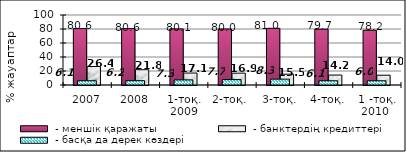
| Category |  - меншік қаражаты |  - банктердің кредиттері |
|---|---|---|
| 2007 | 80.595 | 26.395 |
| 2008 | 80.552 | 21.842 |
| 1-тоқ. 2009 | 80.13 | 17.08 |
| 2-тоқ.  | 80.01 | 16.91 |
| 3-тоқ. | 80.97 | 15.48 |
| 4-тоқ. | 79.73 | 14.2 |
| 1 -тоқ. 2010  | 78.19 | 14 |